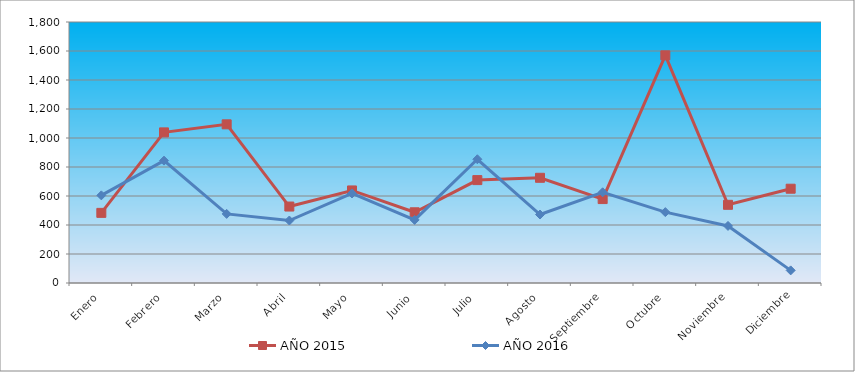
| Category | AÑO 2015 | AÑO 2016 |
|---|---|---|
| Enero | 483.7 | 604.474 |
| Febrero | 1038.767 | 843.908 |
| Marzo | 1094.273 | 476.434 |
| Abril | 527.313 | 430.862 |
| Mayo | 638.326 | 617.293 |
| Junio | 487.665 | 435.005 |
| Julio | 709.692 | 853.438 |
| Agosto | 725.551 | 472.291 |
| Septiembre | 578.855 | 625.579 |
| Octubre | 1570.044 | 488.863 |
| Noviembre | 539.207 | 393.576 |
| Diciembre | 650.22 | 87.001 |